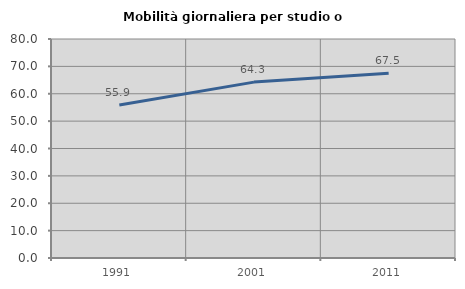
| Category | Mobilità giornaliera per studio o lavoro |
|---|---|
| 1991.0 | 55.898 |
| 2001.0 | 64.254 |
| 2011.0 | 67.452 |